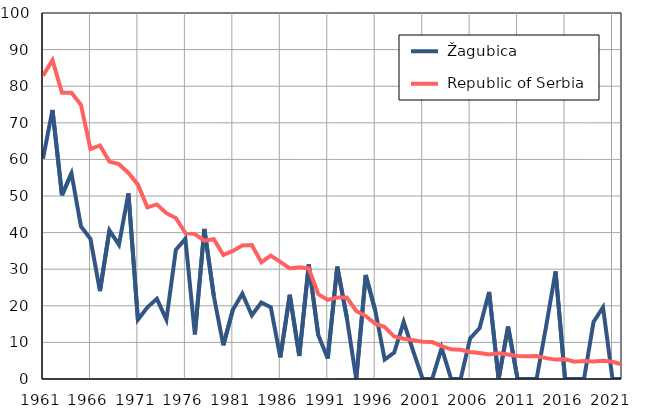
| Category |  Žagubica |  Republic of Serbia |
|---|---|---|
| 1961.0 | 60.2 | 82.9 |
| 1962.0 | 73.5 | 87.1 |
| 1963.0 | 50.2 | 78.2 |
| 1964.0 | 56.2 | 78.2 |
| 1965.0 | 41.7 | 74.9 |
| 1966.0 | 38.3 | 62.8 |
| 1967.0 | 24 | 63.8 |
| 1968.0 | 40.6 | 59.4 |
| 1969.0 | 36.7 | 58.7 |
| 1970.0 | 50.7 | 56.3 |
| 1971.0 | 16.2 | 53.1 |
| 1972.0 | 19.6 | 46.9 |
| 1973.0 | 21.9 | 47.7 |
| 1974.0 | 16.2 | 45.3 |
| 1975.0 | 35.3 | 44 |
| 1976.0 | 38.3 | 39.9 |
| 1977.0 | 12.2 | 39.6 |
| 1978.0 | 41 | 37.8 |
| 1979.0 | 22.6 | 38.2 |
| 1980.0 | 9.2 | 33.9 |
| 1981.0 | 18.9 | 35 |
| 1982.0 | 23.3 | 36.5 |
| 1983.0 | 17.4 | 36.6 |
| 1984.0 | 20.9 | 31.9 |
| 1985.0 | 19.6 | 33.7 |
| 1986.0 | 5.9 | 32 |
| 1987.0 | 23 | 30.2 |
| 1988.0 | 6.3 | 30.5 |
| 1989.0 | 31.3 | 30.2 |
| 1990.0 | 12 | 23.2 |
| 1991.0 | 5.6 | 21.6 |
| 1992.0 | 30.7 | 22.3 |
| 1993.0 | 16.9 | 22.3 |
| 1994.0 | 0 | 18.6 |
| 1995.0 | 28.4 | 17.2 |
| 1996.0 | 18.8 | 15.1 |
| 1997.0 | 5.3 | 14.2 |
| 1998.0 | 7.2 | 11.6 |
| 1999.0 | 15.6 | 11 |
| 2000.0 | 7.6 | 10.6 |
| 2001.0 | 0 | 10.2 |
| 2002.0 | 0 | 10.1 |
| 2003.0 | 8.5 | 9 |
| 2004.0 | 0 | 8.1 |
| 2005.0 | 0 | 8 |
| 2006.0 | 11.1 | 7.4 |
| 2007.0 | 13.9 | 7.1 |
| 2008.0 | 23.8 | 6.7 |
| 2009.0 | 0 | 7 |
| 2010.0 | 14.3 | 6.7 |
| 2011.0 | 0 | 6.3 |
| 2012.0 | 0 | 6.2 |
| 2013.0 | 0 | 6.3 |
| 2014.0 | 14.3 | 5.7 |
| 2015.0 | 29.4 | 5.3 |
| 2016.0 | 0 | 5.4 |
| 2017.0 | 0 | 4.7 |
| 2018.0 | 0 | 4.9 |
| 2019.0 | 15.6 | 4.8 |
| 2020.0 | 19.6 | 5 |
| 2021.0 | 0 | 4.7 |
| 2022.0 | 0 | 4 |